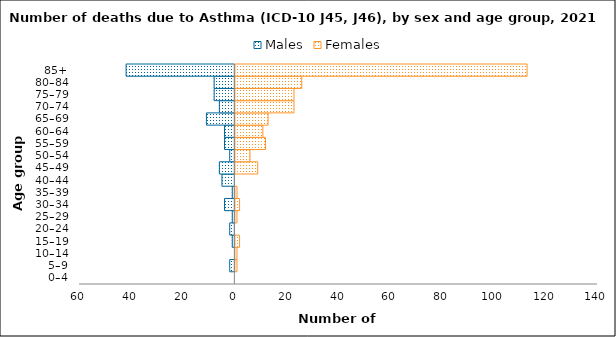
| Category | Males | Females |
|---|---|---|
| 0–4 | 0 | 0 |
| 5–9 | -2 | 1 |
| 10–14 | 0 | 1 |
| 15–19 | -1 | 2 |
| 20–24 | -2 | 0 |
| 25–29 | -1 | 1 |
| 30–34 | -4 | 2 |
| 35–39 | -1 | 1 |
| 40–44 | -5 | 0 |
| 45–49 | -6 | 9 |
| 50–54 | -2 | 6 |
| 55–59 | -4 | 12 |
| 60–64 | -4 | 11 |
| 65–69 | -11 | 13 |
| 70–74 | -6 | 23 |
| 75–79 | -8 | 23 |
| 80–84 | -8 | 26 |
| 85+ | -42 | 113 |